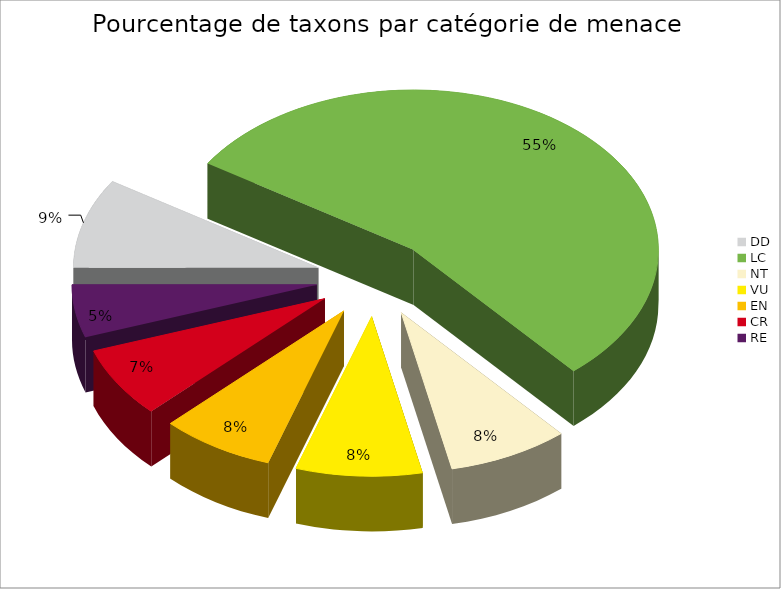
| Category | Total |
|---|---|
| DD | 135 |
| LC | 811 |
| NT | 119 |
| VU | 124 |
| EN | 112 |
| CR | 106 |
| RE | 79 |